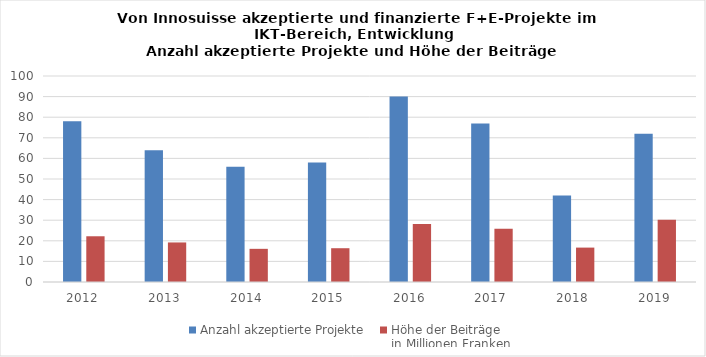
| Category | Anzahl akzeptierte Projekte  | Höhe der Beiträge
in Millionen Franken |
|---|---|---|
| 2012.0 | 78 | 22.2 |
| 2013.0 | 64 | 19.2 |
| 2014.0 | 56 | 16.1 |
| 2015.0 | 58 | 16.4 |
| 2016.0 | 90 | 28.1 |
| 2017.0 | 77 | 25.8 |
| 2018.0 | 42 | 16.7 |
| 2019.0 | 72 | 30.2 |